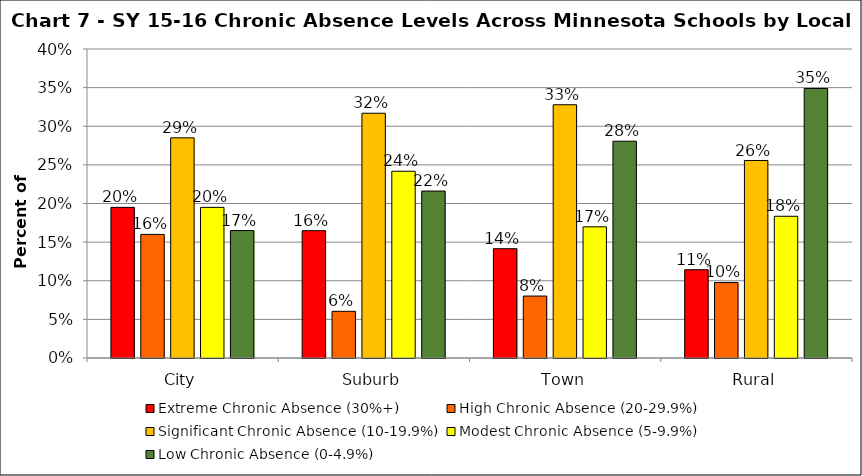
| Category | Extreme Chronic Absence (30%+) | High Chronic Absence (20-29.9%) | Significant Chronic Absence (10-19.9%) | Modest Chronic Absence (5-9.9%) | Low Chronic Absence (0-4.9%) |
|---|---|---|---|---|---|
| 0 | 0.195 | 0.16 | 0.285 | 0.195 | 0.165 |
| 1 | 0.165 | 0.06 | 0.317 | 0.242 | 0.216 |
| 2 | 0.142 | 0.08 | 0.328 | 0.17 | 0.281 |
| 3 | 0.114 | 0.098 | 0.256 | 0.183 | 0.349 |